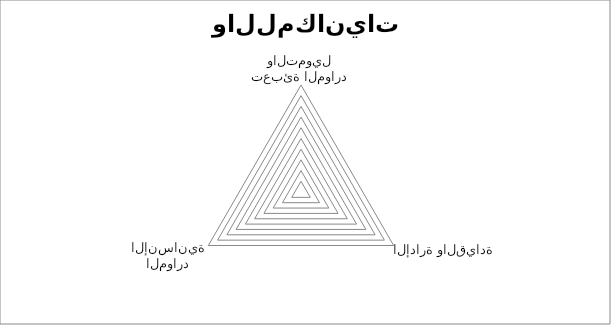
| Category | Series 0 |
|---|---|
| تعبئة الموارد والتمويل | 0 |
| الإدارة والقيادة | 0 |
| الموارد الإنسانية | 0 |